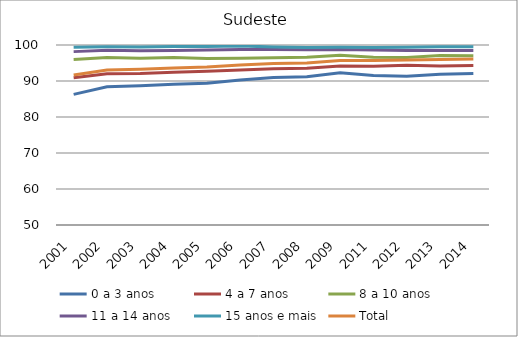
| Category | 0 a 3 anos | 4 a 7 anos | 8 a 10 anos | 11 a 14 anos | 15 anos e mais | Total |
|---|---|---|---|---|---|---|
| 2001.0 | 86.29 | 90.88 | 95.98 | 98.16 | 99.38 | 91.67 |
| 2002.0 | 88.4 | 92.04 | 96.55 | 98.56 | 99.51 | 93.04 |
| 2003.0 | 88.66 | 92.09 | 96.33 | 98.41 | 99.44 | 93.25 |
| 2004.0 | 89.08 | 92.4 | 96.52 | 98.47 | 99.55 | 93.61 |
| 2005.0 | 89.35 | 92.68 | 96.22 | 98.63 | 99.6 | 93.88 |
| 2006.0 | 90.28 | 93.03 | 96.32 | 98.74 | 99.74 | 94.45 |
| 2007.0 | 90.95 | 93.38 | 96.49 | 98.74 | 99.47 | 94.84 |
| 2008.0 | 91.2 | 93.57 | 96.58 | 98.68 | 99.32 | 95.03 |
| 2009.0 | 92.28 | 94.18 | 97.12 | 98.75 | 99.38 | 95.66 |
| 2011.0 | 91.5 | 94.1 | 96.6 | 98.6 | 99.3 | 95.7 |
| 2012.0 | 91.3 | 94.4 | 96.5 | 98.5 | 99.4 | 95.8 |
| 2013.0 | 91.9 | 94.2 | 97.1 | 98.5 | 99.5 | 96 |
| 2014.0 | 92.1 | 94.3 | 97 | 98.5 | 99.5 | 96.1 |